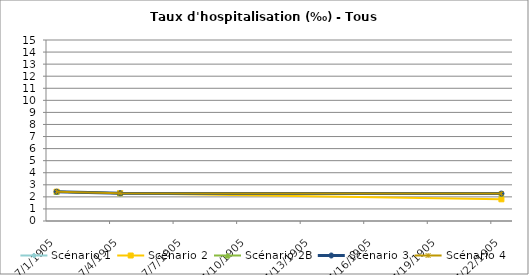
| Category | Scénario 1 | Scénario 2 | Scénario 2B | Scénario 3 | Scénario 4 |
|---|---|---|---|---|---|
| 2009.0 | 2.43 | 2.43 | 2.43 | 2.43 | 2.43 |
| 2012.0 | 2.302 | 2.302 | 2.302 | 2.302 | 2.302 |
| 2030.0 | 2.273 | 1.798 | 2.273 | 2.273 | 2.273 |